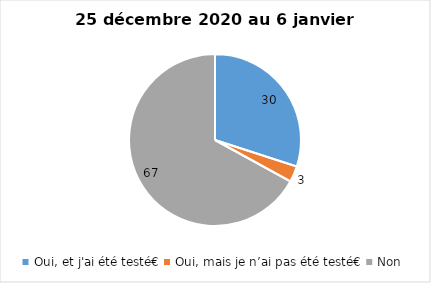
| Category | Series 0 |
|---|---|
| Oui, et j'ai été testé€ | 30 |
| Oui, mais je n’ai pas été testé€ | 3 |
| Non | 67 |